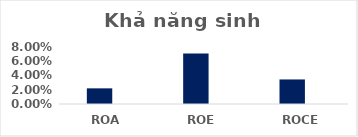
| Category | Series 0 | Series 1 | Series 2 | Series 3 |
|---|---|---|---|---|
| ROA | 0.022 |  |  |  |
| ROE | 0.071 |  |  |  |
| ROCE | 0.034 |  |  |  |